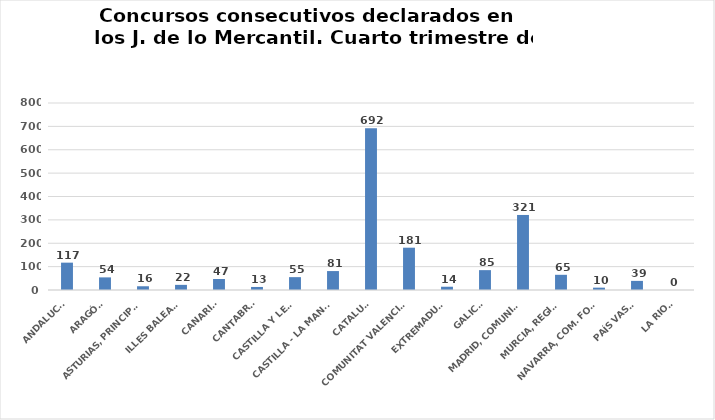
| Category | Series 0 |
|---|---|
| ANDALUCÍA | 117 |
| ARAGÓN | 54 |
| ASTURIAS, PRINCIPADO | 16 |
| ILLES BALEARS | 22 |
| CANARIAS | 47 |
| CANTABRIA | 13 |
| CASTILLA Y LEÓN | 55 |
| CASTILLA - LA MANCHA | 81 |
| CATALUÑA | 692 |
| COMUNITAT VALENCIANA | 181 |
| EXTREMADURA | 14 |
| GALICIA | 85 |
| MADRID, COMUNIDAD | 321 |
| MURCIA, REGIÓN | 65 |
| NAVARRA, COM. FORAL | 10 |
| PAÍS VASCO | 39 |
| LA RIOJA | 0 |